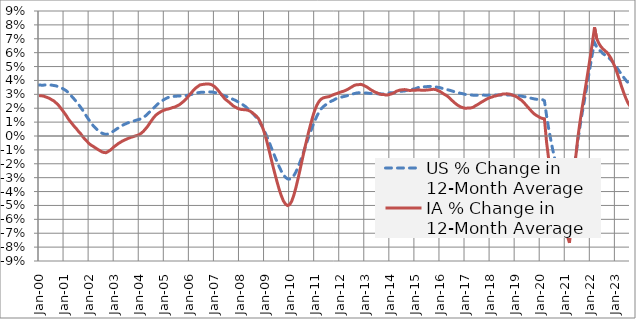
| Category | US % Change in 12-Month Average | IA % Change in 12-Month Average |
|---|---|---|
| 2000-01-01 | 0.037 | 0.029 |
| 2000-02-01 | 0.037 | 0.029 |
| 2000-03-01 | 0.037 | 0.029 |
| 2000-04-01 | 0.037 | 0.028 |
| 2000-05-01 | 0.037 | 0.028 |
| 2000-06-01 | 0.037 | 0.027 |
| 2000-07-01 | 0.037 | 0.026 |
| 2000-08-01 | 0.036 | 0.025 |
| 2000-09-01 | 0.036 | 0.024 |
| 2000-10-01 | 0.036 | 0.023 |
| 2000-11-01 | 0.035 | 0.021 |
| 2000-12-01 | 0.034 | 0.019 |
| 2001-01-01 | 0.034 | 0.017 |
| 2001-02-01 | 0.033 | 0.015 |
| 2001-03-01 | 0.031 | 0.012 |
| 2001-04-01 | 0.03 | 0.01 |
| 2001-05-01 | 0.028 | 0.008 |
| 2001-06-01 | 0.026 | 0.007 |
| 2001-07-01 | 0.024 | 0.005 |
| 2001-08-01 | 0.023 | 0.003 |
| 2001-09-01 | 0.02 | 0.001 |
| 2001-10-01 | 0.018 | -0.001 |
| 2001-11-01 | 0.016 | -0.002 |
| 2001-12-01 | 0.014 | -0.004 |
| 2002-01-01 | 0.011 | -0.006 |
| 2002-02-01 | 0.009 | -0.007 |
| 2002-03-01 | 0.007 | -0.008 |
| 2002-04-01 | 0.006 | -0.009 |
| 2002-05-01 | 0.004 | -0.01 |
| 2002-06-01 | 0.003 | -0.01 |
| 2002-07-01 | 0.002 | -0.011 |
| 2002-08-01 | 0.001 | -0.012 |
| 2002-09-01 | 0.001 | -0.012 |
| 2002-10-01 | 0.001 | -0.011 |
| 2002-11-01 | 0.002 | -0.01 |
| 2002-12-01 | 0.003 | -0.009 |
| 2003-01-01 | 0.004 | -0.008 |
| 2003-02-01 | 0.005 | -0.007 |
| 2003-03-01 | 0.006 | -0.005 |
| 2003-04-01 | 0.007 | -0.004 |
| 2003-05-01 | 0.008 | -0.004 |
| 2003-06-01 | 0.008 | -0.003 |
| 2003-07-01 | 0.009 | -0.002 |
| 2003-08-01 | 0.01 | -0.002 |
| 2003-09-01 | 0.01 | -0.001 |
| 2003-10-01 | 0.011 | -0.001 |
| 2003-11-01 | 0.011 | 0 |
| 2003-12-01 | 0.012 | 0 |
| 2004-01-01 | 0.012 | 0.001 |
| 2004-02-01 | 0.013 | 0.002 |
| 2004-03-01 | 0.013 | 0.003 |
| 2004-04-01 | 0.015 | 0.005 |
| 2004-05-01 | 0.016 | 0.007 |
| 2004-06-01 | 0.017 | 0.009 |
| 2004-07-01 | 0.019 | 0.011 |
| 2004-08-01 | 0.02 | 0.013 |
| 2004-09-01 | 0.022 | 0.015 |
| 2004-10-01 | 0.023 | 0.016 |
| 2004-11-01 | 0.024 | 0.017 |
| 2004-12-01 | 0.025 | 0.018 |
| 2005-01-01 | 0.026 | 0.019 |
| 2005-02-01 | 0.027 | 0.019 |
| 2005-03-01 | 0.028 | 0.019 |
| 2005-04-01 | 0.028 | 0.02 |
| 2005-05-01 | 0.028 | 0.021 |
| 2005-06-01 | 0.029 | 0.021 |
| 2005-07-01 | 0.029 | 0.022 |
| 2005-08-01 | 0.029 | 0.022 |
| 2005-09-01 | 0.029 | 0.023 |
| 2005-10-01 | 0.029 | 0.025 |
| 2005-11-01 | 0.029 | 0.026 |
| 2005-12-01 | 0.029 | 0.028 |
| 2006-01-01 | 0.03 | 0.03 |
| 2006-02-01 | 0.03 | 0.031 |
| 2006-03-01 | 0.03 | 0.033 |
| 2006-04-01 | 0.031 | 0.035 |
| 2006-05-01 | 0.031 | 0.036 |
| 2006-06-01 | 0.031 | 0.037 |
| 2006-07-01 | 0.031 | 0.037 |
| 2006-08-01 | 0.032 | 0.037 |
| 2006-09-01 | 0.032 | 0.037 |
| 2006-10-01 | 0.032 | 0.038 |
| 2006-11-01 | 0.032 | 0.037 |
| 2006-12-01 | 0.032 | 0.037 |
| 2007-01-01 | 0.031 | 0.036 |
| 2007-02-01 | 0.031 | 0.034 |
| 2007-03-01 | 0.031 | 0.032 |
| 2007-04-01 | 0.03 | 0.03 |
| 2007-05-01 | 0.029 | 0.029 |
| 2007-06-01 | 0.029 | 0.027 |
| 2007-07-01 | 0.028 | 0.026 |
| 2007-08-01 | 0.028 | 0.024 |
| 2007-09-01 | 0.027 | 0.023 |
| 2007-10-01 | 0.026 | 0.022 |
| 2007-11-01 | 0.026 | 0.021 |
| 2007-12-01 | 0.025 | 0.02 |
| 2008-01-01 | 0.024 | 0.019 |
| 2008-02-01 | 0.023 | 0.019 |
| 2008-03-01 | 0.022 | 0.019 |
| 2008-04-01 | 0.021 | 0.019 |
| 2008-05-01 | 0.02 | 0.019 |
| 2008-06-01 | 0.018 | 0.018 |
| 2008-07-01 | 0.017 | 0.017 |
| 2008-08-01 | 0.015 | 0.016 |
| 2008-09-01 | 0.013 | 0.014 |
| 2008-10-01 | 0.011 | 0.013 |
| 2008-11-01 | 0.009 | 0.01 |
| 2008-12-01 | 0.006 | 0.006 |
| 2009-01-01 | 0.003 | 0.002 |
| 2009-02-01 | 0 | -0.003 |
| 2009-03-01 | -0.004 | -0.009 |
| 2009-04-01 | -0.008 | -0.016 |
| 2009-05-01 | -0.011 | -0.022 |
| 2009-06-01 | -0.015 | -0.028 |
| 2009-07-01 | -0.019 | -0.033 |
| 2009-08-01 | -0.022 | -0.038 |
| 2009-09-01 | -0.025 | -0.043 |
| 2009-10-01 | -0.028 | -0.047 |
| 2009-11-01 | -0.03 | -0.049 |
| 2009-12-01 | -0.031 | -0.05 |
| 2010-01-01 | -0.031 | -0.049 |
| 2010-02-01 | -0.03 | -0.047 |
| 2010-03-01 | -0.029 | -0.043 |
| 2010-04-01 | -0.026 | -0.037 |
| 2010-05-01 | -0.023 | -0.031 |
| 2010-06-01 | -0.019 | -0.024 |
| 2010-07-01 | -0.014 | -0.017 |
| 2010-08-01 | -0.01 | -0.01 |
| 2010-09-01 | -0.006 | -0.004 |
| 2010-10-01 | -0.001 | 0.002 |
| 2010-11-01 | 0.003 | 0.008 |
| 2010-12-01 | 0.007 | 0.014 |
| 2011-01-01 | 0.011 | 0.018 |
| 2011-02-01 | 0.014 | 0.022 |
| 2011-03-01 | 0.017 | 0.025 |
| 2011-04-01 | 0.019 | 0.026 |
| 2011-05-01 | 0.021 | 0.027 |
| 2011-06-01 | 0.022 | 0.028 |
| 2011-07-01 | 0.023 | 0.028 |
| 2011-08-01 | 0.024 | 0.028 |
| 2011-09-01 | 0.025 | 0.029 |
| 2011-10-01 | 0.026 | 0.03 |
| 2011-11-01 | 0.027 | 0.03 |
| 2011-12-01 | 0.027 | 0.031 |
| 2012-01-01 | 0.028 | 0.031 |
| 2012-02-01 | 0.028 | 0.032 |
| 2012-03-01 | 0.028 | 0.032 |
| 2012-04-01 | 0.029 | 0.033 |
| 2012-05-01 | 0.029 | 0.034 |
| 2012-06-01 | 0.03 | 0.035 |
| 2012-07-01 | 0.03 | 0.036 |
| 2012-08-01 | 0.031 | 0.036 |
| 2012-09-01 | 0.031 | 0.037 |
| 2012-10-01 | 0.031 | 0.037 |
| 2012-11-01 | 0.031 | 0.037 |
| 2012-12-01 | 0.031 | 0.037 |
| 2013-01-01 | 0.031 | 0.036 |
| 2013-02-01 | 0.031 | 0.035 |
| 2013-03-01 | 0.031 | 0.034 |
| 2013-04-01 | 0.031 | 0.033 |
| 2013-05-01 | 0.03 | 0.032 |
| 2013-06-01 | 0.03 | 0.032 |
| 2013-07-01 | 0.03 | 0.031 |
| 2013-08-01 | 0.03 | 0.03 |
| 2013-09-01 | 0.03 | 0.03 |
| 2013-10-01 | 0.03 | 0.03 |
| 2013-11-01 | 0.03 | 0.03 |
| 2013-12-01 | 0.031 | 0.03 |
| 2014-01-01 | 0.031 | 0.03 |
| 2014-02-01 | 0.031 | 0.03 |
| 2014-03-01 | 0.031 | 0.031 |
| 2014-04-01 | 0.032 | 0.032 |
| 2014-05-01 | 0.032 | 0.033 |
| 2014-06-01 | 0.032 | 0.033 |
| 2014-07-01 | 0.032 | 0.033 |
| 2014-08-01 | 0.032 | 0.033 |
| 2014-09-01 | 0.033 | 0.033 |
| 2014-10-01 | 0.033 | 0.033 |
| 2014-11-01 | 0.033 | 0.033 |
| 2014-12-01 | 0.034 | 0.033 |
| 2015-01-01 | 0.034 | 0.033 |
| 2015-02-01 | 0.035 | 0.033 |
| 2015-03-01 | 0.035 | 0.033 |
| 2015-04-01 | 0.035 | 0.033 |
| 2015-05-01 | 0.035 | 0.033 |
| 2015-06-01 | 0.035 | 0.033 |
| 2015-07-01 | 0.036 | 0.033 |
| 2015-08-01 | 0.036 | 0.033 |
| 2015-09-01 | 0.036 | 0.034 |
| 2015-10-01 | 0.035 | 0.034 |
| 2015-11-01 | 0.035 | 0.033 |
| 2015-12-01 | 0.035 | 0.033 |
| 2016-01-01 | 0.035 | 0.032 |
| 2016-02-01 | 0.034 | 0.031 |
| 2016-03-01 | 0.034 | 0.03 |
| 2016-04-01 | 0.033 | 0.029 |
| 2016-05-01 | 0.033 | 0.028 |
| 2016-06-01 | 0.033 | 0.027 |
| 2016-07-01 | 0.032 | 0.025 |
| 2016-08-01 | 0.032 | 0.024 |
| 2016-09-01 | 0.031 | 0.023 |
| 2016-10-01 | 0.031 | 0.022 |
| 2016-11-01 | 0.031 | 0.021 |
| 2016-12-01 | 0.03 | 0.02 |
| 2017-01-01 | 0.03 | 0.02 |
| 2017-02-01 | 0.03 | 0.02 |
| 2017-03-01 | 0.03 | 0.02 |
| 2017-04-01 | 0.03 | 0.02 |
| 2017-05-01 | 0.029 | 0.021 |
| 2017-06-01 | 0.029 | 0.022 |
| 2017-07-01 | 0.029 | 0.023 |
| 2017-08-01 | 0.029 | 0.024 |
| 2017-09-01 | 0.029 | 0.025 |
| 2017-10-01 | 0.029 | 0.025 |
| 2017-11-01 | 0.029 | 0.026 |
| 2017-12-01 | 0.029 | 0.027 |
| 2018-01-01 | 0.03 | 0.028 |
| 2018-02-01 | 0.03 | 0.028 |
| 2018-03-01 | 0.03 | 0.029 |
| 2018-04-01 | 0.029 | 0.029 |
| 2018-05-01 | 0.03 | 0.029 |
| 2018-06-01 | 0.029 | 0.03 |
| 2018-07-01 | 0.029 | 0.03 |
| 2018-08-01 | 0.03 | 0.03 |
| 2018-09-01 | 0.03 | 0.03 |
| 2018-10-01 | 0.03 | 0.03 |
| 2018-11-01 | 0.03 | 0.03 |
| 2018-12-01 | 0.029 | 0.029 |
| 2019-01-01 | 0.029 | 0.029 |
| 2019-02-01 | 0.029 | 0.028 |
| 2019-03-01 | 0.029 | 0.027 |
| 2019-04-01 | 0.029 | 0.026 |
| 2019-05-01 | 0.028 | 0.024 |
| 2019-06-01 | 0.028 | 0.023 |
| 2019-07-01 | 0.028 | 0.021 |
| 2019-08-01 | 0.027 | 0.019 |
| 2019-09-01 | 0.027 | 0.017 |
| 2019-10-01 | 0.027 | 0.016 |
| 2019-11-01 | 0.027 | 0.015 |
| 2019-12-01 | 0.026 | 0.014 |
| 2020-01-01 | 0.026 | 0.013 |
| 2020-02-01 | 0.026 | 0.013 |
| 2020-03-01 | 0.025 | 0.012 |
| 2020-04-01 | 0.015 | -0.004 |
| 2020-05-01 | 0.006 | -0.016 |
| 2020-06-01 | -0.002 | -0.027 |
| 2020-07-01 | -0.01 | -0.035 |
| 2020-08-01 | -0.017 | -0.042 |
| 2020-09-01 | -0.023 | -0.047 |
| 2020-10-01 | -0.029 | -0.053 |
| 2020-11-01 | -0.034 | -0.058 |
| 2020-12-01 | -0.04 | -0.063 |
| 2021-01-01 | -0.045 | -0.067 |
| 2021-02-01 | -0.05 | -0.072 |
| 2021-03-01 | -0.054 | -0.077 |
| 2021-04-01 | -0.039 | -0.051 |
| 2021-05-01 | -0.026 | -0.032 |
| 2021-06-01 | -0.015 | -0.015 |
| 2021-07-01 | -0.003 | -0.001 |
| 2021-08-01 | 0.006 | 0.01 |
| 2021-09-01 | 0.016 | 0.02 |
| 2021-10-01 | 0.024 | 0.029 |
| 2021-11-01 | 0.033 | 0.038 |
| 2021-12-01 | 0.042 | 0.048 |
| 2022-01-01 | 0.051 | 0.057 |
| 2022-02-01 | 0.06 | 0.068 |
| 2022-03-01 | 0.067 | 0.078 |
| 2022-04-01 | 0.064 | 0.07 |
| 2022-05-01 | 0.062 | 0.067 |
| 2022-06-01 | 0.061 | 0.064 |
| 2022-07-01 | 0.059 | 0.063 |
| 2022-08-01 | 0.058 | 0.061 |
| 2022-09-01 | 0.057 | 0.06 |
| 2022-10-01 | 0.056 | 0.058 |
| 2022-11-01 | 0.055 | 0.056 |
| 2022-12-01 | 0.053 | 0.052 |
| 2023-01-01 | 0.051 | 0.049 |
| 2023-02-01 | 0.049 | 0.045 |
| 2023-03-01 | 0.046 | 0.04 |
| 2023-04-01 | 0.044 | 0.035 |
| 2023-05-01 | 0.042 | 0.031 |
| 2023-06-01 | 0.04 | 0.027 |
| 2023-07-01 | 0.038 | 0.024 |
| 2023-08-01 | 0.037 | 0.021 |
| 2023-09-01 | 0.035 | 0.02 |
| 2023-10-01 | 0.034 | 0.019 |